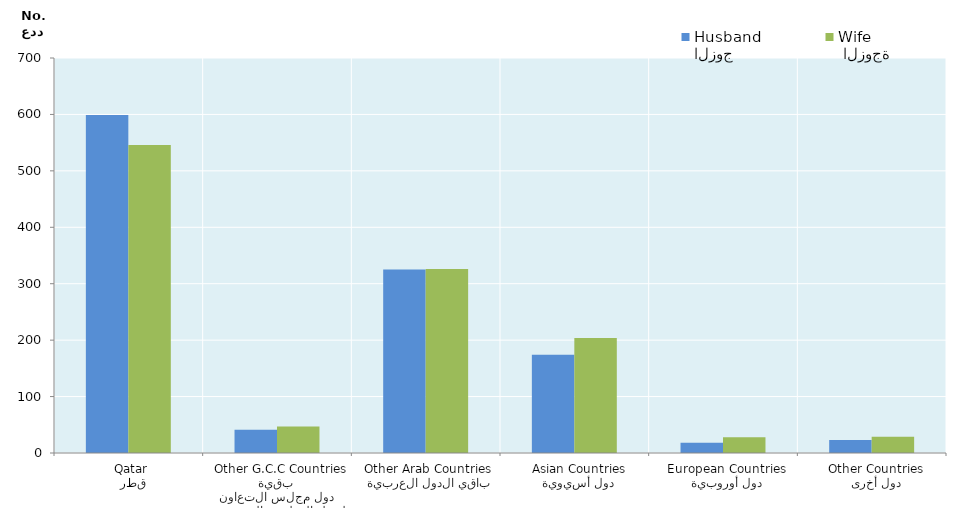
| Category | الزوج
Husband |  الزوجة
Wife |
|---|---|---|
|   قطر
 Qatar | 599 | 546 |
|  بقية دول مجلس التعاون لدول الخليج العربية
  Other G.C.C Countries | 41 | 47 |
|   باقي الدول العربية
 Other Arab Countries | 325 | 326 |
|   دول أسيوية
  Asian Countries | 174 | 204 |
|   دول أوروبية
  European Countries | 18 | 28 |
|   دول أخرى
  Other Countries | 23 | 29 |